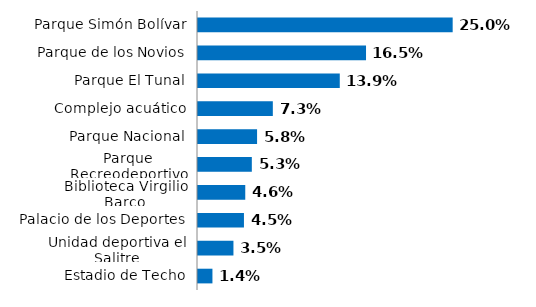
| Category | Series 0 |
|---|---|
| Parque Simón Bolívar | 0.25 |
| Parque de los Novios | 0.165 |
| Parque El Tunal | 0.139 |
| Complejo acuático | 0.073 |
| Parque Nacional | 0.058 |
| Parque Recreodeportivo | 0.053 |
| Biblioteca Virgilio Barco | 0.046 |
| Palacio de los Deportes | 0.045 |
| Unidad deportiva el Salitre | 0.035 |
| Estadio de Techo | 0.014 |